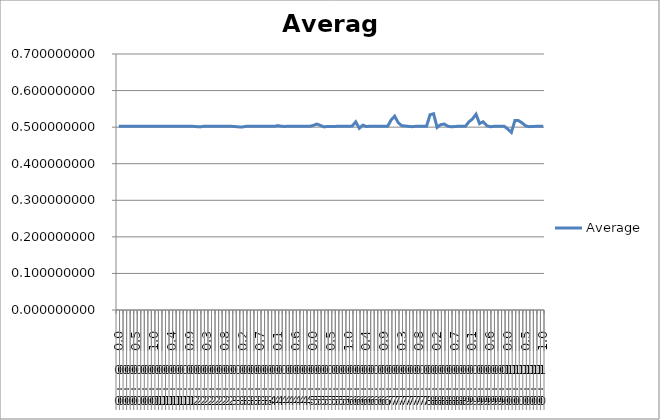
| Category | Average |
|---|---|
| 0 | 0.502 |
| 1 | 0.502 |
| 2 | 0.502 |
| 3 | 0.502 |
| 4 | 0.502 |
| 5 | 0.502 |
| 6 | 0.502 |
| 7 | 0.502 |
| 8 | 0.502 |
| 9 | 0.502 |
| 10 | 0.502 |
| 11 | 0.502 |
| 12 | 0.502 |
| 13 | 0.502 |
| 14 | 0.502 |
| 15 | 0.502 |
| 16 | 0.502 |
| 17 | 0.502 |
| 18 | 0.502 |
| 19 | 0.502 |
| 20 | 0.502 |
| 21 | 0.502 |
| 22 | 0.501 |
| 23 | 0.501 |
| 24 | 0.502 |
| 25 | 0.502 |
| 26 | 0.502 |
| 27 | 0.502 |
| 28 | 0.502 |
| 29 | 0.502 |
| 30 | 0.502 |
| 31 | 0.502 |
| 32 | 0.502 |
| 33 | 0.502 |
| 34 | 0.501 |
| 35 | 0.501 |
| 36 | 0.502 |
| 37 | 0.503 |
| 38 | 0.502 |
| 39 | 0.502 |
| 40 | 0.502 |
| 41 | 0.502 |
| 42 | 0.502 |
| 43 | 0.502 |
| 44 | 0.502 |
| 45 | 0.504 |
| 46 | 0.502 |
| 47 | 0.502 |
| 48 | 0.502 |
| 49 | 0.503 |
| 50 | 0.502 |
| 51 | 0.502 |
| 52 | 0.502 |
| 53 | 0.502 |
| 54 | 0.502 |
| 55 | 0.505 |
| 56 | 0.508 |
| 57 | 0.505 |
| 58 | 0.501 |
| 59 | 0.502 |
| 60 | 0.502 |
| 61 | 0.502 |
| 62 | 0.502 |
| 63 | 0.502 |
| 64 | 0.502 |
| 65 | 0.502 |
| 66 | 0.503 |
| 67 | 0.515 |
| 68 | 0.497 |
| 69 | 0.505 |
| 70 | 0.502 |
| 71 | 0.502 |
| 72 | 0.502 |
| 73 | 0.502 |
| 74 | 0.502 |
| 75 | 0.502 |
| 76 | 0.502 |
| 77 | 0.52 |
| 78 | 0.53 |
| 79 | 0.512 |
| 80 | 0.504 |
| 81 | 0.503 |
| 82 | 0.502 |
| 83 | 0.501 |
| 84 | 0.502 |
| 85 | 0.502 |
| 86 | 0.502 |
| 87 | 0.502 |
| 88 | 0.534 |
| 89 | 0.537 |
| 90 | 0.499 |
| 91 | 0.507 |
| 92 | 0.508 |
| 93 | 0.503 |
| 94 | 0.501 |
| 95 | 0.502 |
| 96 | 0.502 |
| 97 | 0.502 |
| 98 | 0.502 |
| 99 | 0.515 |
| 100 | 0.522 |
| 101 | 0.535 |
| 102 | 0.51 |
| 103 | 0.515 |
| 104 | 0.504 |
| 105 | 0.501 |
| 106 | 0.502 |
| 107 | 0.502 |
| 108 | 0.502 |
| 109 | 0.502 |
| 110 | 0.495 |
| 111 | 0.486 |
| 112 | 0.518 |
| 113 | 0.518 |
| 114 | 0.512 |
| 115 | 0.504 |
| 116 | 0.501 |
| 117 | 0.501 |
| 118 | 0.503 |
| 119 | 0.502 |
| 120 | 0.502 |